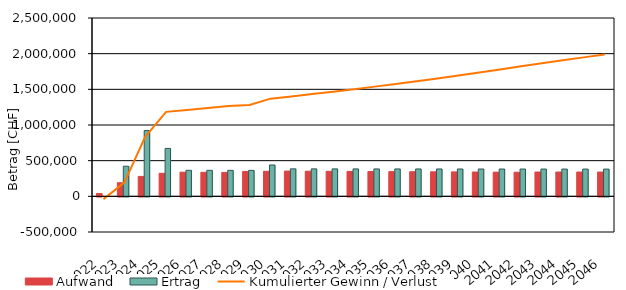
| Category | Aufwand | Ertrag |
|---|---|---|
| 2022.0 | 39300 | 0 |
| 2023.0 | 190431.729 | 421776.025 |
| 2024.0 | 279255.545 | 922523.613 |
| 2025.0 | 322861.807 | 671726.794 |
| 2026.0 | 338623.091 | 364691.527 |
| 2027.0 | 337099.854 | 364377.266 |
| 2028.0 | 335582.57 | 364072.135 |
| 2029.0 | 348414.524 | 363776.13 |
| 2030.0 | 351212.509 | 439479.208 |
| 2031.0 | 353975.557 | 385178.878 |
| 2032.0 | 352476.013 | 384898.244 |
| 2033.0 | 350982.771 | 384627.267 |
| 2034.0 | 349495.825 | 384365.94 |
| 2035.0 | 348015.169 | 384114.26 |
| 2036.0 | 346540.797 | 383872.222 |
| 2037.0 | 345072.704 | 383639.822 |
| 2038.0 | 343895.721 | 383417.057 |
| 2039.0 | 342440.17 | 383203.923 |
| 2040.0 | 340990.883 | 383000.416 |
| 2041.0 | 339547.853 | 382806.534 |
| 2042.0 | 338111.078 | 382622.273 |
| 2043.0 | 341033.719 | 382447.632 |
| 2044.0 | 340884.438 | 382282.607 |
| 2045.0 | 340741.397 | 382127.197 |
| 2046.0 | 340604.594 | 381981.4 |